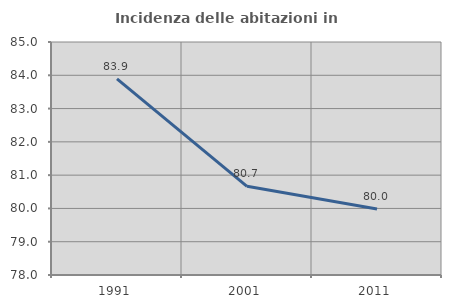
| Category | Incidenza delle abitazioni in proprietà  |
|---|---|
| 1991.0 | 83.891 |
| 2001.0 | 80.665 |
| 2011.0 | 79.983 |